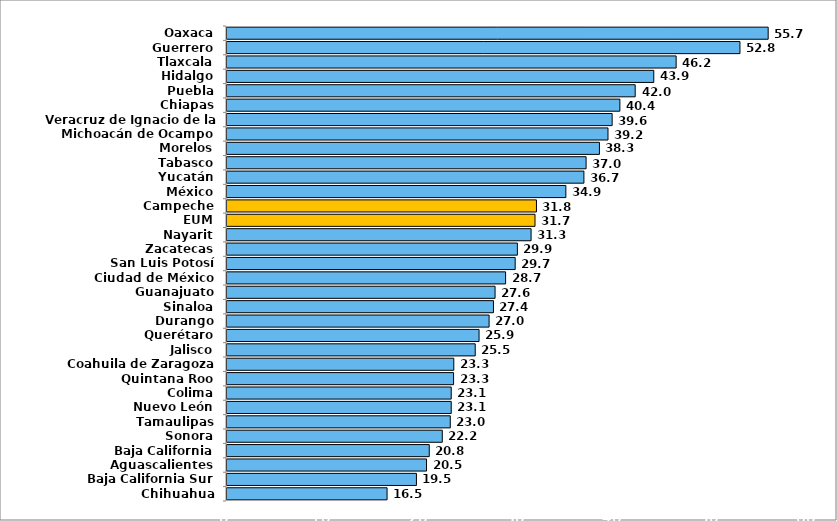
| Category | Series 0 |
|---|---|
| Oaxaca | 55.696 |
| Guerrero | 52.792 |
| Tlaxcala | 46.225 |
| Hidalgo | 43.922 |
| Puebla | 42.009 |
| Chiapas | 40.434 |
| Veracruz de Ignacio de la Llave | 39.638 |
| Michoacán de Ocampo | 39.21 |
| Morelos | 38.33 |
| Tabasco | 36.957 |
| Yucatán | 36.732 |
| México | 34.875 |
| Campeche | 31.848 |
| EUM | 31.7 |
| Nayarit | 31.296 |
| Zacatecas | 29.884 |
| San Luis Potosí | 29.658 |
| Ciudad de México | 28.672 |
| Guanajuato | 27.589 |
| Sinaloa | 27.422 |
| Durango | 26.975 |
| Querétaro | 25.94 |
| Jalisco | 25.547 |
| Coahuila de Zaragoza | 23.342 |
| Quintana Roo | 23.319 |
| Colima | 23.077 |
| Nuevo León | 23.076 |
| Tamaulipas | 22.98 |
| Sonora | 22.157 |
| Baja California | 20.816 |
| Aguascalientes | 20.533 |
| Baja California Sur | 19.495 |
| Chihuahua | 16.473 |